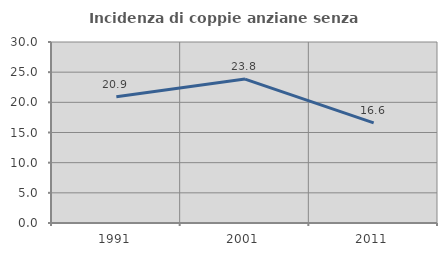
| Category | Incidenza di coppie anziane senza figli  |
|---|---|
| 1991.0 | 20.913 |
| 2001.0 | 23.849 |
| 2011.0 | 16.585 |